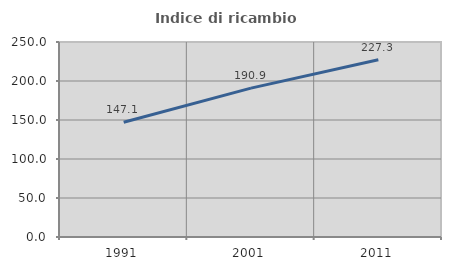
| Category | Indice di ricambio occupazionale  |
|---|---|
| 1991.0 | 147.059 |
| 2001.0 | 190.909 |
| 2011.0 | 227.273 |